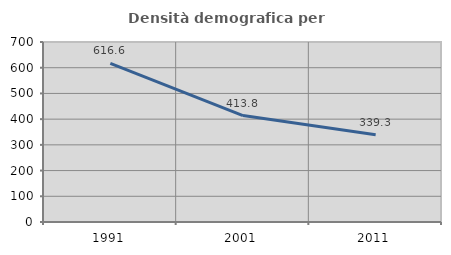
| Category | Densità demografica |
|---|---|
| 1991.0 | 616.557 |
| 2001.0 | 413.761 |
| 2011.0 | 339.257 |